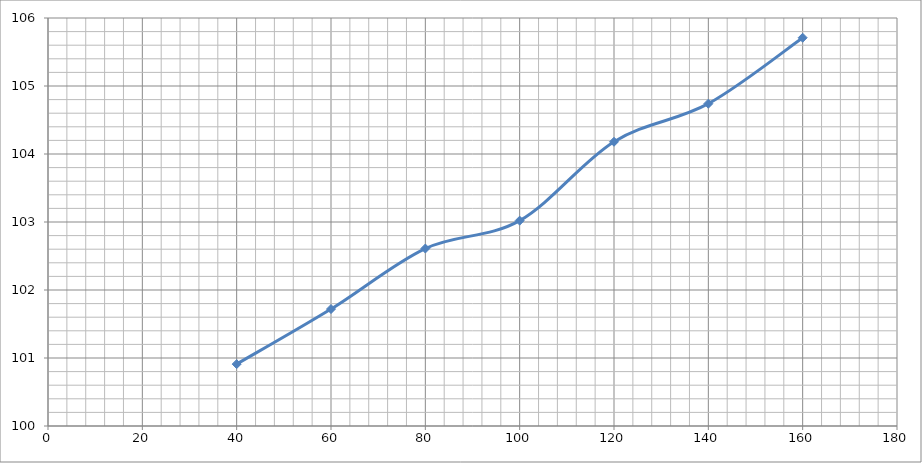
| Category | Series 0 |
|---|---|
| 40.0 | 100.91 |
| 60.0 | 101.72 |
| 80.0 | 102.61 |
| 100.0 | 103.02 |
| 120.0 | 104.18 |
| 140.0 | 104.74 |
| 160.0 | 105.71 |